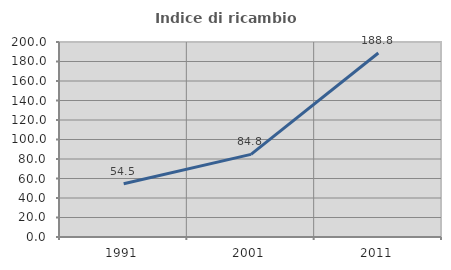
| Category | Indice di ricambio occupazionale  |
|---|---|
| 1991.0 | 54.545 |
| 2001.0 | 84.774 |
| 2011.0 | 188.764 |